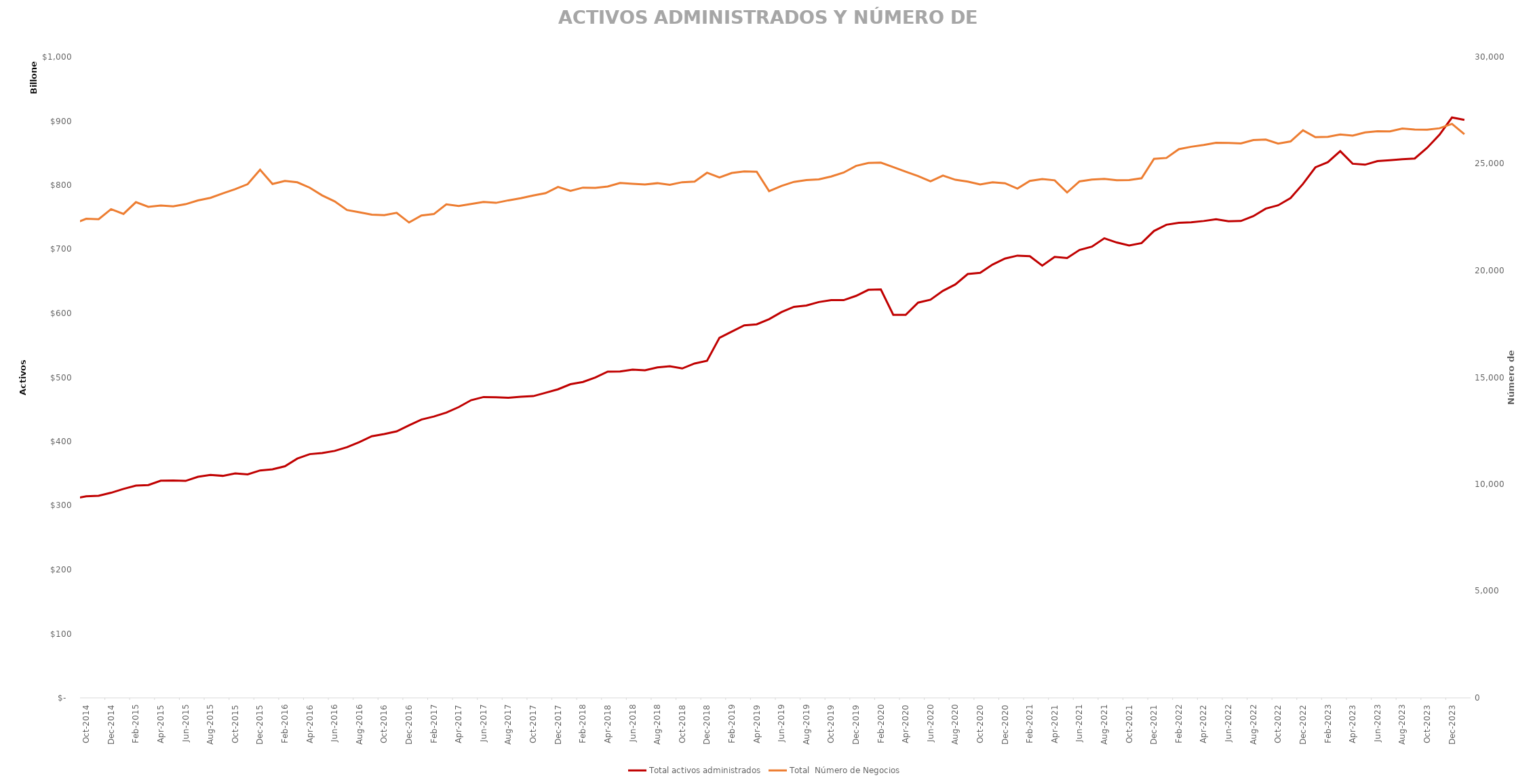
| Category | Total activos administrados |
|---|---|
| 2014-01-01 | 275831100.32 |
| 2014-02-01 | 282540287.38 |
| 2014-03-01 | 293725410.34 |
| 2014-04-01 | 297083130.06 |
| 2014-05-01 | 299989040.55 |
| 2014-06-01 | 299856845.58 |
| 2014-07-01 | 304100994.88 |
| 2014-08-01 | 315107203.45 |
| 2014-09-01 | 310941517.35 |
| 2014-10-01 | 314517386.46 |
| 2014-11-01 | 315319470.57 |
| 2014-12-01 | 320028520.24 |
| 2015-01-01 | 326117158.47 |
| 2015-02-01 | 331144520.36 |
| 2015-03-01 | 331981172.805 |
| 2015-04-01 | 338926238.767 |
| 2015-05-01 | 339240079.978 |
| 2015-06-01 | 338507344.528 |
| 2015-07-01 | 344906623.679 |
| 2015-08-01 | 347934876.102 |
| 2015-09-01 | 346437581.721 |
| 2015-10-01 | 350288175.716 |
| 2015-11-01 | 348695859.246 |
| 2015-12-01 | 354836337.141 |
| 2016-01-01 | 356608868.945 |
| 2016-02-01 | 361371487.01 |
| 2016-03-01 | 373359908.982 |
| 2016-04-01 | 380293748.088 |
| 2016-05-01 | 382057296.776 |
| 2016-06-01 | 385284005.51 |
| 2016-07-01 | 391162222.786 |
| 2016-08-01 | 399100246.403 |
| 2016-09-01 | 408243528.619 |
| 2016-10-01 | 411681112.939 |
| 2016-11-01 | 415877569.787 |
| 2016-12-01 | 425216779.143 |
| 2017-01-01 | 434258404.05 |
| 2017-02-01 | 438987856.756 |
| 2017-03-01 | 445157660.961 |
| 2017-04-01 | 453702785.873 |
| 2017-05-01 | 464497841.829 |
| 2017-06-01 | 469415788.649 |
| 2017-07-01 | 468962799.85 |
| 2017-08-01 | 468143792.161 |
| 2017-09-01 | 469727845.072 |
| 2017-10-01 | 470813763.716 |
| 2017-11-01 | 476084556.132 |
| 2017-12-01 | 481507641 |
| 2018-01-01 | 489352745 |
| 2018-02-01 | 492886628.093 |
| 2018-03-01 | 499799870.286 |
| 2018-04-01 | 509038822.941 |
| 2018-05-01 | 509341122.338 |
| 2018-06-01 | 512175223.444 |
| 2018-07-01 | 511213443.142 |
| 2018-08-01 | 515588338.106 |
| 2018-09-01 | 517468154.4 |
| 2018-10-01 | 513959839.346 |
| 2018-11-01 | 521784789.471 |
| 2018-12-01 | 525928025.494 |
| 2019-01-01 | 561800639.859 |
| 2019-02-01 | 571578939.256 |
| 2019-03-01 | 581325145.256 |
| 2019-04-01 | 582838730.822 |
| 2019-05-01 | 590827846.86 |
| 2019-06-01 | 601936170.817 |
| 2019-07-01 | 610096294.565 |
| 2019-08-01 | 612140239.027 |
| 2019-09-01 | 617592572.435 |
| 2019-10-01 | 620638755.372 |
| 2019-11-01 | 620586121.495 |
| 2019-12-01 | 627250437.809 |
| 2020-01-01 | 636706668.633 |
| 2020-02-01 | 637198516.488 |
| 2020-03-01 | 597723884.646 |
| 2020-04-01 | 597600675.349 |
| 2020-05-01 | 616751030.203 |
| 2020-06-01 | 621198055.701 |
| 2020-07-01 | 635091274.008 |
| 2020-08-01 | 645093768.784 |
| 2020-09-01 | 661306941.69 |
| 2020-10-01 | 663299299.526 |
| 2020-11-01 | 676074287.005 |
| 2020-12-01 | 685532677.99 |
| 2021-01-01 | 690054991.119 |
| 2021-02-01 | 689209474 |
| 2021-03-01 | 674411742 |
| 2021-04-01 | 688056860 |
| 2021-05-01 | 686344745 |
| 2021-06-01 | 698900940 |
| 2021-07-01 | 704023453 |
| 2021-08-01 | 717123710 |
| 2021-09-01 | 710522026 |
| 2021-10-01 | 705830872 |
| 2021-11-01 | 709659656 |
| 2021-12-01 | 728465533 |
| 2022-01-01 | 738257792.027 |
| 2022-02-01 | 741357389 |
| 2022-03-01 | 742190668 |
| 2022-04-01 | 744051639 |
| 2022-05-01 | 746820596 |
| 2022-06-01 | 743647441 |
| 2022-07-01 | 744073781 |
| 2022-08-01 | 751671713 |
| 2022-09-01 | 763317879 |
| 2022-10-01 | 768576147 |
| 2022-11-01 | 779807959 |
| 2022-12-01 | 801936667 |
| 2023-01-01 | 827802263 |
| 2023-02-01 | 835782942 |
| 2023-03-01 | 852990791 |
| 2023-04-01 | 833424769 |
| 2023-05-01 | 831915383 |
| 2023-06-01 | 837521419 |
| 2023-07-01 | 838947589 |
| 2023-08-01 | 840533946 |
| 2023-09-01 | 841619605 |
| 2023-10-01 | 858280594 |
| 2023-11-01 | 878778815 |
| 2023-12-01 | 905540128 |
| 2024-01-01 | 901885597 |